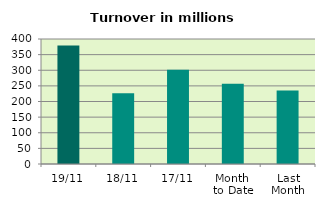
| Category | Series 0 |
|---|---|
| 19/11 | 379.489 |
| 18/11 | 226.656 |
| 17/11 | 301.776 |
| Month 
to Date | 256.86 |
| Last
Month | 235.36 |